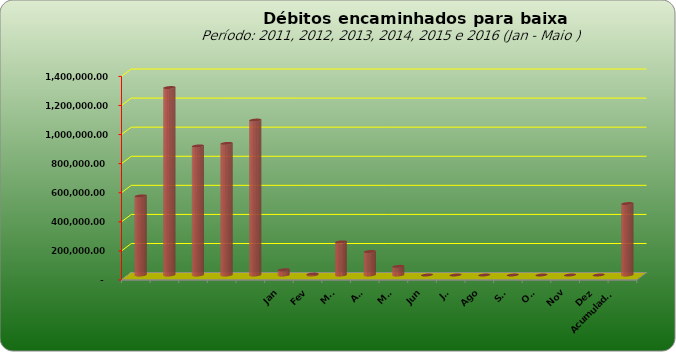
| Category |  543.796,20  |
|---|---|
|  | 543796.2 |
|  | 1289053.69 |
|  | 887573.08 |
|  | 905052.31 |
|  | 1065434.28 |
| Jan | 35964.03 |
| Fev | 6417.54 |
| Mar | 227804.72 |
| Abr | 161576.79 |
| Mai | 59557.82 |
| Jun | 0 |
| Jul | 0 |
| Ago | 0 |
| Set | 0 |
| Out | 0 |
| Nov | 0 |
| Dez | 0 |
| Acumulado
2016 | 491320.9 |